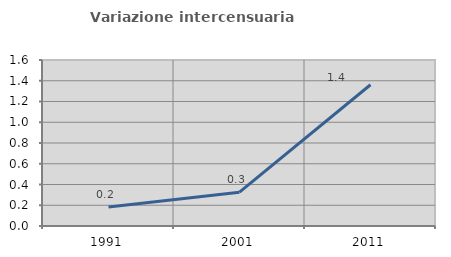
| Category | Variazione intercensuaria annua |
|---|---|
| 1991.0 | 0.183 |
| 2001.0 | 0.326 |
| 2011.0 | 1.361 |